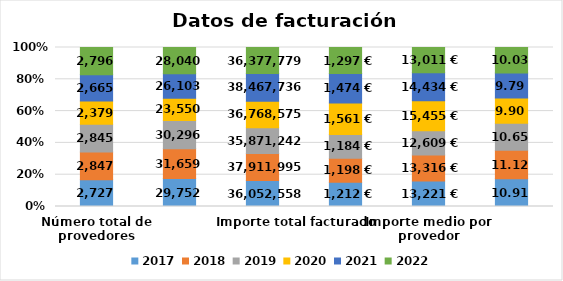
| Category | 2017 | 2018 | 2019 | 2020 | 2021 | 2022 |
|---|---|---|---|---|---|---|
| Número total de provedores | 2727 | 2847 | 2845 | 2379 | 2665 | 2796 |
| Número total de facturas | 29752 | 31659 | 30296 | 23550 | 26103 | 28040 |
| Importe total facturado | 36052558 | 37911995.42 | 35871241.55 | 36768575.42 | 38467736 | 36377778.66 |
| Importe medio por factura | 1212 | 1197.511 | 1184.026 | 1561.298 | 1473.69 | 1297.353 |
| Importe medio por provedor | 13220.593 | 13316.472 | 12608.521 | 15455.475 | 14434.42 | 13010.65 |
| Nº medio de facturas por provedor | 10.91 | 11.12 | 10.649 | 9.899 | 9.79 | 10.029 |